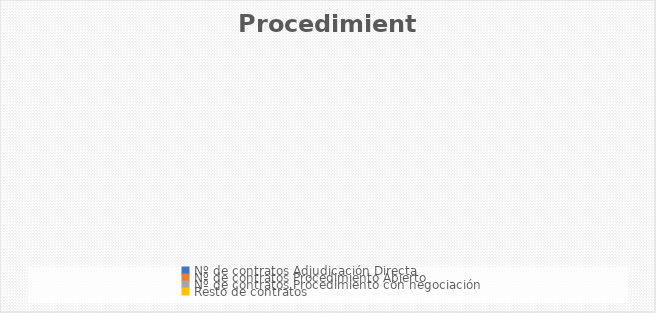
| Category | Series 0 |
|---|---|
| Nº de contratos Adjudicación Directa | 0 |
| Nº de contratos Procedimiento Abierto | 0 |
| Nº de contratos Procedimiento con negociación | 0 |
| Resto de contratos | 0 |